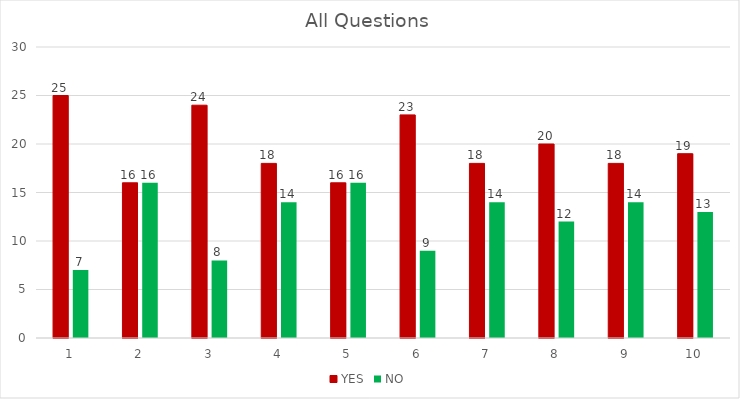
| Category | YES | NO |
|---|---|---|
| 0 | 25 | 7 |
| 1 | 16 | 16 |
| 2 | 24 | 8 |
| 3 | 18 | 14 |
| 4 | 16 | 16 |
| 5 | 23 | 9 |
| 6 | 18 | 14 |
| 7 | 20 | 12 |
| 8 | 18 | 14 |
| 9 | 19 | 13 |